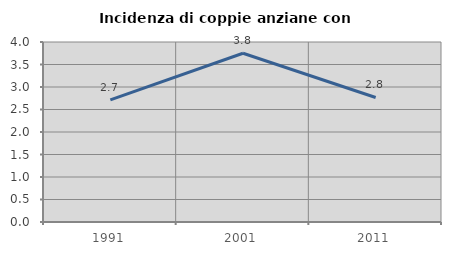
| Category | Incidenza di coppie anziane con figli |
|---|---|
| 1991.0 | 2.715 |
| 2001.0 | 3.75 |
| 2011.0 | 2.767 |